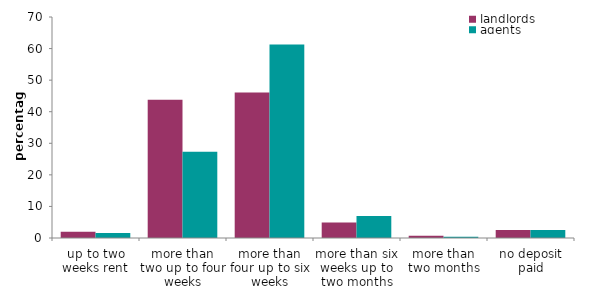
| Category | landlords | agents |
|---|---|---|
| up to two weeks rent | 1.997 | 1.564 |
| more than two up to four weeks | 43.799 | 27.285 |
| more than four up to six weeks | 46.07 | 61.285 |
| more than six weeks up to two months | 4.926 | 6.97 |
| more than two months | 0.697 | 0.392 |
| no deposit paid | 2.51 | 2.504 |